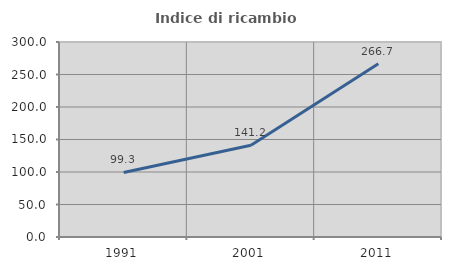
| Category | Indice di ricambio occupazionale  |
|---|---|
| 1991.0 | 99.291 |
| 2001.0 | 141.176 |
| 2011.0 | 266.667 |